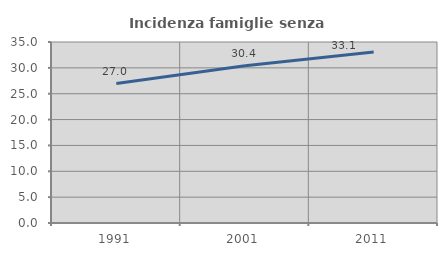
| Category | Incidenza famiglie senza nuclei |
|---|---|
| 1991.0 | 26.957 |
| 2001.0 | 30.4 |
| 2011.0 | 33.051 |